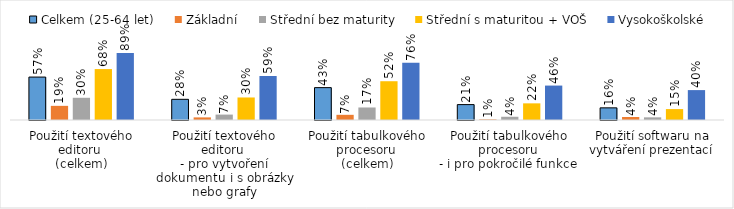
| Category | Celkem (25-64 let) | Základní | Střední bez maturity | Střední s maturitou + VOŠ | Vysokoškolské |
|---|---|---|---|---|---|
| Použití textového editoru 
(celkem) | 0.572 | 0.189 | 0.296 | 0.679 | 0.893 |
| Použití textového editoru 
- pro vytvoření dokumentu i s obrázky nebo grafy | 0.276 | 0.035 | 0.072 | 0.3 | 0.586 |
| Použití tabulkového procesoru 
(celkem) | 0.432 | 0.069 | 0.167 | 0.517 | 0.762 |
| Použití tabulkového procesoru 
- i pro pokročilé funkce  | 0.205 | 0.008 | 0.043 | 0.222 | 0.459 |
| Použití softwaru na vytváření prezentací  | 0.162 | 0.04 | 0.035 | 0.145 | 0.399 |